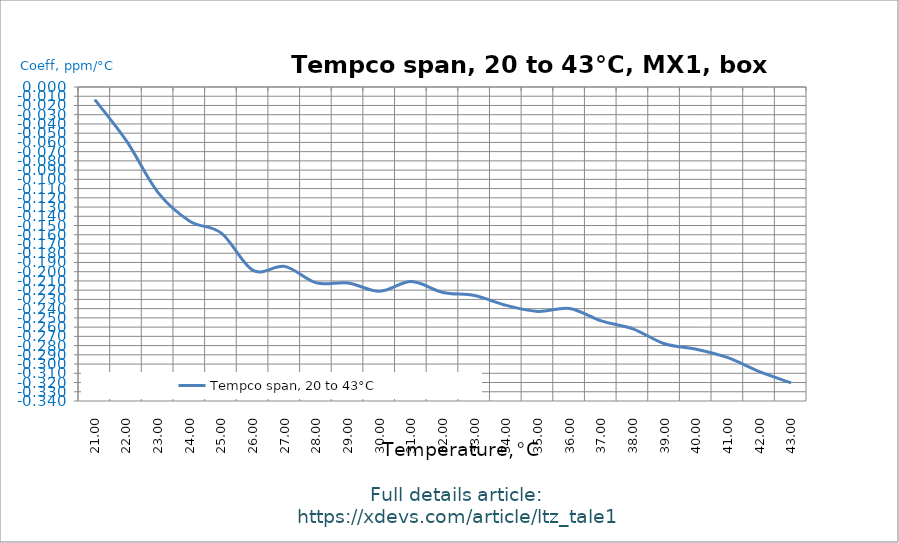
| Category | Tempco span, 20 to 43°C |
|---|---|
| 21.0 | -0.014 |
| 22.0 | -0.058 |
| 23.0 | -0.114 |
| 24.0 | -0.145 |
| 25.0 | -0.158 |
| 26.0 | -0.199 |
| 27.0 | -0.194 |
| 28.0 | -0.212 |
| 29.0 | -0.212 |
| 30.0 | -0.221 |
| 31.0 | -0.211 |
| 32.0 | -0.222 |
| 33.0 | -0.226 |
| 34.0 | -0.237 |
| 35.0 | -0.243 |
| 36.0 | -0.24 |
| 37.0 | -0.253 |
| 38.0 | -0.262 |
| 39.0 | -0.278 |
| 40.0 | -0.284 |
| 41.0 | -0.293 |
| 42.0 | -0.308 |
| 43.0 | -0.32 |